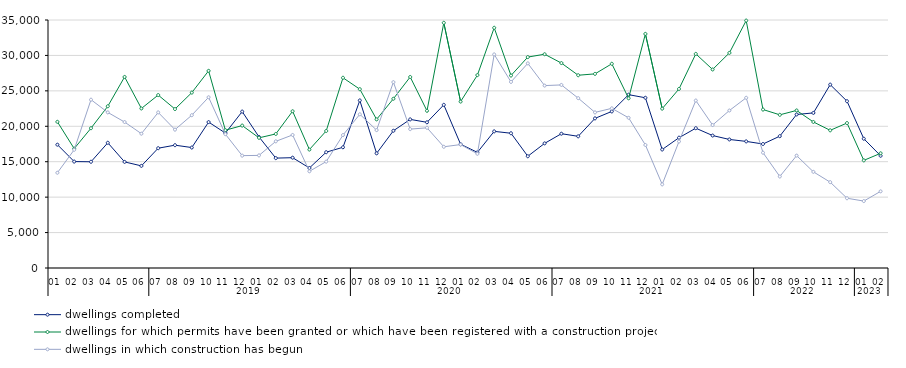
| Category | dwellings completed | dwellings for which permits have been granted or which have been registered with a construction project | dwellings in which construction has begun |
|---|---|---|---|
| 0 | 17405 | 20630 | 13444 |
| 1 | 15021 | 16849 | 16682 |
| 2 | 14991 | 19732 | 23752 |
| 3 | 17673 | 22828 | 21958 |
| 4 | 14974 | 26965 | 20600 |
| 5 | 14412 | 22514 | 18956 |
| 6 | 16908 | 24407 | 21958 |
| 7 | 17334 | 22431 | 19528 |
| 8 | 16998 | 24754 | 21566 |
| 9 | 20592 | 27824 | 24095 |
| 10 | 19042 | 19448 | 18884 |
| 11 | 22075 | 20101 | 15858 |
| 12 | 18501 | 18370 | 15891 |
| 13 | 15507 | 18920 | 17875 |
| 14 | 15569 | 22122 | 18777 |
| 15 | 14116 | 16714 | 13647 |
| 16 | 16343 | 19338 | 15012 |
| 17 | 17036 | 26845 | 18763 |
| 18 | 23648 | 25237 | 21690 |
| 19 | 16183 | 20975 | 19460 |
| 20 | 19369 | 23885 | 26232 |
| 21 | 20973 | 26960 | 19601 |
| 22 | 20560 | 22183 | 19785 |
| 23 | 23026 | 34605 | 17109 |
| 24 | 17462 | 23485 | 17419 |
| 25 | 16322 | 27222 | 16116 |
| 26 | 19282 | 33901 | 30143 |
| 27 | 19019 | 27163 | 26261 |
| 28 | 15772 | 29768 | 28878 |
| 29 | 17587 | 30170 | 25744 |
| 30 | 18952 | 28922 | 25837 |
| 31 | 18583 | 27204 | 23971 |
| 32 | 21117 | 27397 | 21959 |
| 33 | 22097 | 28821 | 22533 |
| 34 | 24463 | 23947 | 21200 |
| 35 | 24024 | 33041 | 17364 |
| 36 | 16723 | 22490 | 11800 |
| 37 | 18388 | 25271 | 17855 |
| 38 | 19731 | 30215 | 23632 |
| 39 | 18694 | 28017 | 20173 |
| 40 | 18140 | 30360 | 22226 |
| 41 | 17868 | 34918 | 24021 |
| 42 | 17500 | 22363 | 16277 |
| 43 | 18606 | 21617 | 12913 |
| 44 | 21666 | 22236 | 15861 |
| 45 | 21887 | 20610 | 13569 |
| 46 | 25878 | 19431 | 12117 |
| 47 | 23540 | 20457 | 9844 |
| 48 | 18244 | 15189 | 9446 |
| 49 | 15838 | 16186 | 10817 |